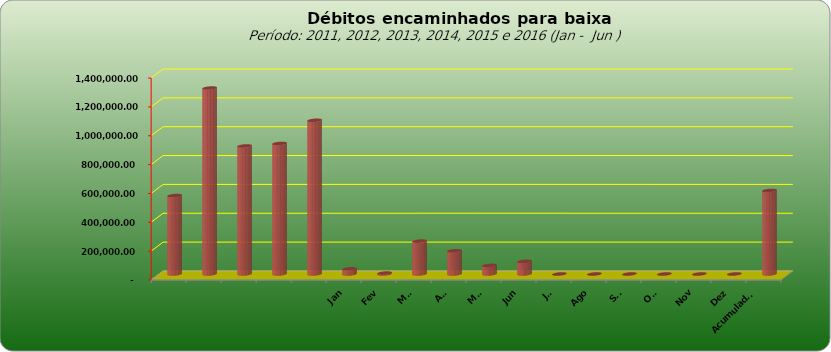
| Category |  543.796,20  |
|---|---|
|  | 543796.2 |
|  | 1289053.69 |
|  | 887573.08 |
|  | 905052.31 |
|  | 1065434.28 |
| Jan | 35964.03 |
| Fev | 6417.54 |
| Mar | 227804.72 |
| Abr | 161576.79 |
| Mai | 59557.82 |
| Jun | 87752.76 |
| Jul | 0 |
| Ago | 0 |
| Set | 0 |
| Out | 0 |
| Nov | 0 |
| Dez | 0 |
| Acumulado
2016 | 579073.66 |